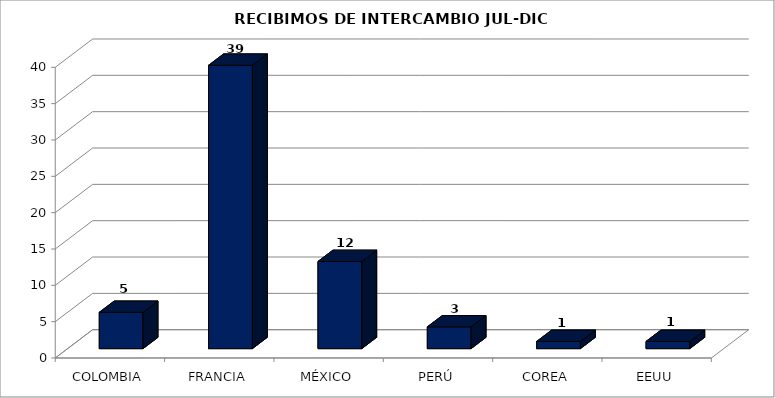
| Category | ALUMNOS |
|---|---|
| COLOMBIA | 5 |
| FRANCIA | 39 |
| MÉXICO | 12 |
| PERÚ | 3 |
| COREA | 1 |
| EEUU | 1 |